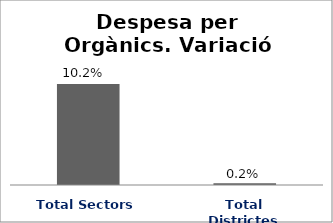
| Category | Series 0 |
|---|---|
| Total Sectors | 0.102 |
| Total Districtes | 0.002 |